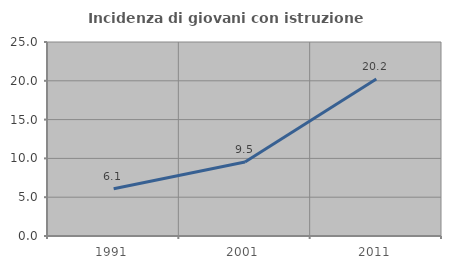
| Category | Incidenza di giovani con istruzione universitaria |
|---|---|
| 1991.0 | 6.087 |
| 2001.0 | 9.535 |
| 2011.0 | 20.234 |